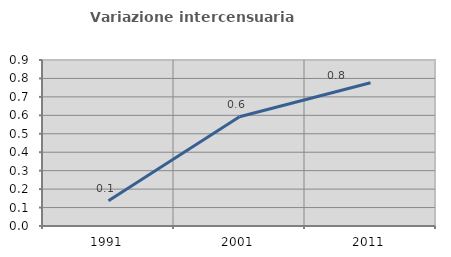
| Category | Variazione intercensuaria annua |
|---|---|
| 1991.0 | 0.137 |
| 2001.0 | 0.592 |
| 2011.0 | 0.777 |